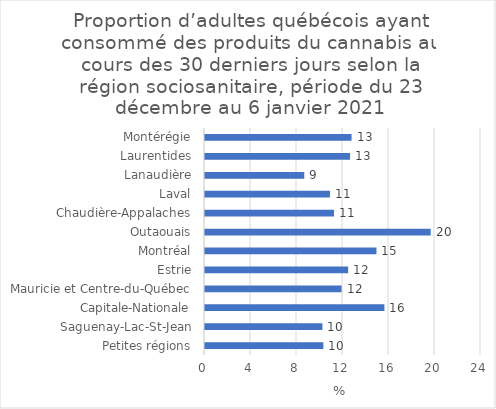
| Category | Series 0 |
|---|---|
| Petites régions | 10.292 |
| Saguenay-Lac-St-Jean | 10.209 |
| Capitale-Nationale | 15.6 |
| Mauricie et Centre-du-Québec | 11.876 |
| Estrie | 12.448 |
| Montréal | 14.909 |
| Outaouais | 19.625 |
| Chaudière-Appalaches | 11.216 |
| Laval | 10.864 |
| Lanaudière | 8.631 |
| Laurentides | 12.616 |
| Montérégie | 12.744 |